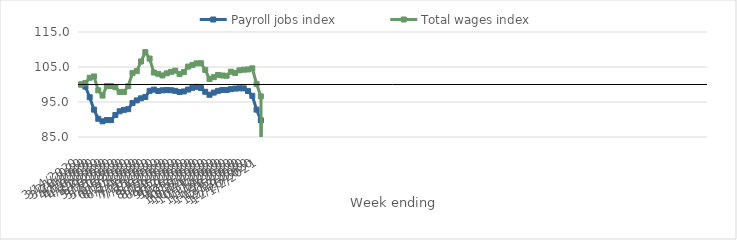
| Category | Payroll jobs index | Total wages index |
|---|---|---|
| 14/03/2020 | 100 | 100 |
| 21/03/2020 | 99.378 | 100.446 |
| 28/03/2020 | 96.358 | 101.933 |
| 04/04/2020 | 92.818 | 102.309 |
| 11/04/2020 | 90.204 | 98.328 |
| 18/04/2020 | 89.479 | 96.834 |
| 25/04/2020 | 89.836 | 99.58 |
| 02/05/2020 | 89.82 | 99.572 |
| 09/05/2020 | 91.284 | 99.224 |
| 16/05/2020 | 92.351 | 97.882 |
| 23/05/2020 | 92.753 | 97.877 |
| 30/05/2020 | 92.951 | 99.521 |
| 06/06/2020 | 94.708 | 103.24 |
| 13/06/2020 | 95.462 | 103.822 |
| 20/06/2020 | 96.053 | 106.574 |
| 27/06/2020 | 96.435 | 109.26 |
| 04/07/2020 | 98.176 | 107.408 |
| 11/07/2020 | 98.532 | 103.415 |
| 18/07/2020 | 98.122 | 103.054 |
| 25/07/2020 | 98.337 | 102.581 |
| 01/08/2020 | 98.4 | 103.185 |
| 08/08/2020 | 98.361 | 103.612 |
| 15/08/2020 | 98.192 | 103.962 |
| 22/08/2020 | 97.852 | 102.989 |
| 29/08/2020 | 98.014 | 103.583 |
| 05/09/2020 | 98.557 | 105.114 |
| 12/09/2020 | 99.045 | 105.552 |
| 19/09/2020 | 99.326 | 106.043 |
| 26/09/2020 | 98.971 | 106.082 |
| 03/10/2020 | 97.922 | 104.183 |
| 10/10/2020 | 97.069 | 101.562 |
| 17/10/2020 | 97.687 | 102.099 |
| 24/10/2020 | 98.19 | 102.725 |
| 31/10/2020 | 98.438 | 102.571 |
| 07/11/2020 | 98.41 | 102.493 |
| 14/11/2020 | 98.673 | 103.648 |
| 21/11/2020 | 98.838 | 103.299 |
| 28/11/2020 | 98.909 | 104.048 |
| 05/12/2020 | 98.899 | 104.23 |
| 12/12/2020 | 98.119 | 104.296 |
| 19/12/2020 | 96.773 | 104.61 |
| 26/12/2020 | 92.822 | 100.17 |
| 02/01/2021 | 89.757 | 96.606 |